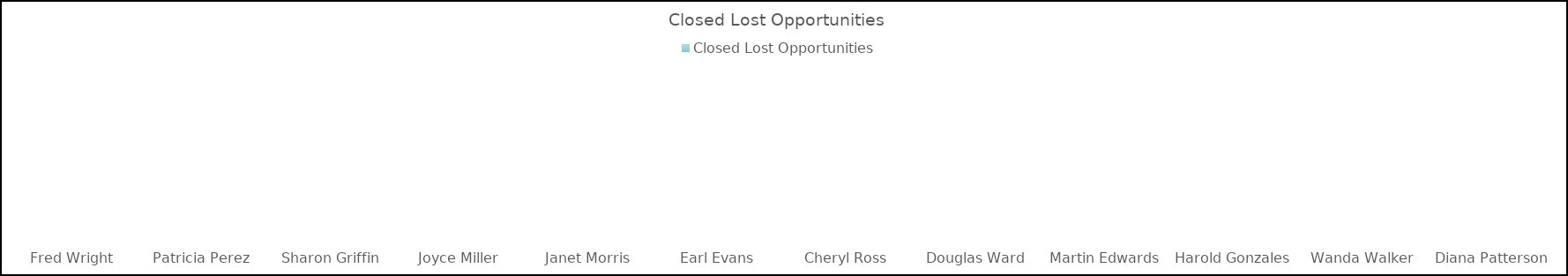
| Category | Closed Lost Opportunities  |
|---|---|
| Fred Wright | 0 |
| Patricia Perez | 0 |
| Sharon Griffin | 0 |
| Joyce Miller | 0 |
| Janet Morris | 0 |
| Earl Evans | 0 |
| Cheryl Ross | 0 |
| Douglas Ward | 0 |
| Martin Edwards | 0 |
| Harold Gonzales | 0 |
| Wanda Walker | 0 |
| Diana Patterson | 0 |